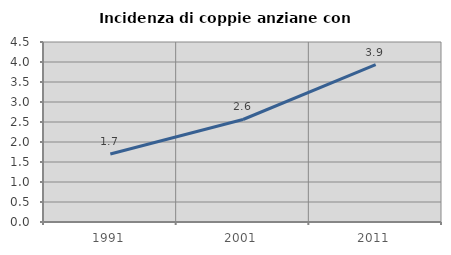
| Category | Incidenza di coppie anziane con figli |
|---|---|
| 1991.0 | 1.701 |
| 2001.0 | 2.563 |
| 2011.0 | 3.932 |